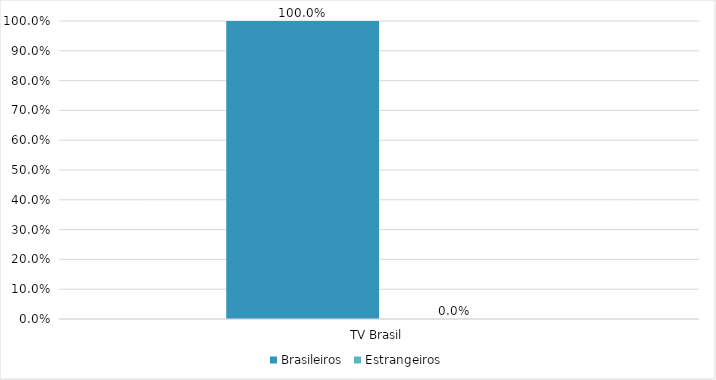
| Category | Brasileiros | Estrangeiros |
|---|---|---|
| TV Brasil | 1 | 0 |